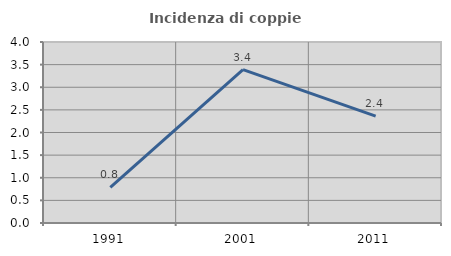
| Category | Incidenza di coppie miste |
|---|---|
| 1991.0 | 0.787 |
| 2001.0 | 3.39 |
| 2011.0 | 2.362 |